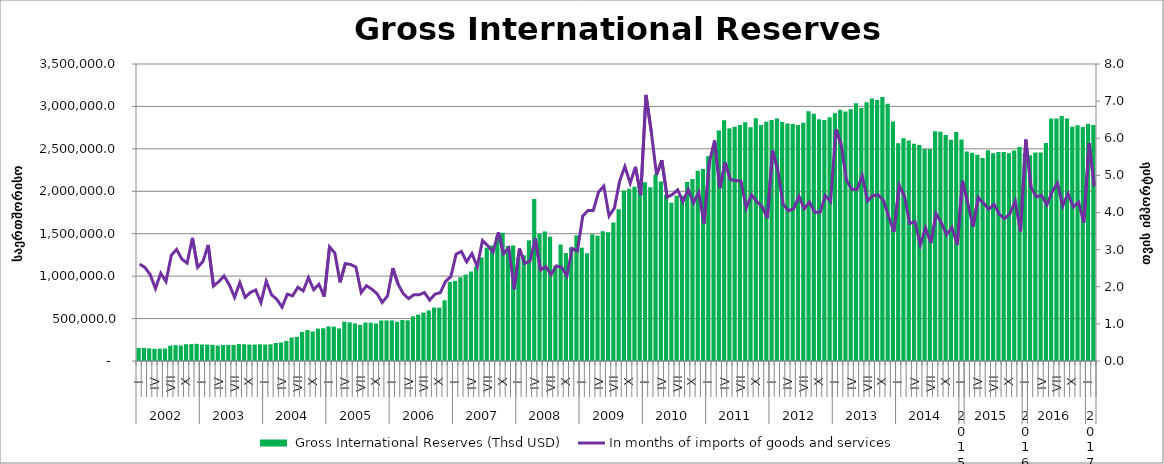
| Category |  Gross International Reserves (Thsd USD) |
|---|---|
| 0 | 154673.704 |
| 1 | 153155.96 |
| 2 | 148933.399 |
| 3 | 143590.72 |
| 4 | 145319.049 |
| 5 | 146717.063 |
| 6 | 180817.631 |
| 7 | 186466.393 |
| 8 | 182356.497 |
| 9 | 197532.435 |
| 10 | 198790.782 |
| 11 | 202167.392 |
| 12 | 194129.443 |
| 13 | 193695.576 |
| 14 | 190301.129 |
| 15 | 182095.356 |
| 16 | 188031.334 |
| 17 | 188868.329 |
| 18 | 189158.085 |
| 19 | 200204.792 |
| 20 | 197358.744 |
| 21 | 193613.624 |
| 22 | 194104.191 |
| 23 | 196187.768 |
| 24 | 193920.86 |
| 25 | 196811.48 |
| 26 | 212514.444 |
| 27 | 217948.403 |
| 28 | 236483.486 |
| 29 | 276240.683 |
| 30 | 284092.921 |
| 31 | 343688.446 |
| 32 | 365243.367 |
| 33 | 348545.007 |
| 34 | 381574.09 |
| 35 | 386639.086 |
| 36 | 408264.957 |
| 37 | 405450.857 |
| 38 | 384368.232 |
| 39 | 463997.258 |
| 40 | 455404.344 |
| 41 | 442635.363 |
| 42 | 426159.688 |
| 43 | 453374.04 |
| 44 | 450574.549 |
| 45 | 442442.215 |
| 46 | 477938.582 |
| 47 | 478645.824 |
| 48 | 477387.048 |
| 49 | 462352.78 |
| 50 | 483457.594 |
| 51 | 479645.109 |
| 52 | 525209.311 |
| 53 | 546894.155 |
| 54 | 569710.236 |
| 55 | 596495.846 |
| 56 | 630472.229 |
| 57 | 628326.311 |
| 58 | 715014.425 |
| 59 | 930833.393 |
| 60 | 944569.356 |
| 61 | 986716.087 |
| 62 | 1018970.638 |
| 63 | 1054278.365 |
| 64 | 1114160.468 |
| 65 | 1220729.487 |
| 66 | 1336062.499 |
| 67 | 1360970.198 |
| 68 | 1469799.647 |
| 69 | 1510431.083 |
| 70 | 1355160.588 |
| 71 | 1361139.94 |
| 72 | 1218380.992 |
| 73 | 1245880.818 |
| 74 | 1421919.99 |
| 75 | 1910253.845 |
| 76 | 1497582.718 |
| 77 | 1526134.644 |
| 78 | 1464749.428 |
| 79 | 1122855.834 |
| 80 | 1373330.153 |
| 81 | 1272102.001 |
| 82 | 1339757.483 |
| 83 | 1480157.563 |
| 84 | 1335830.434 |
| 85 | 1269325.862 |
| 86 | 1493108.058 |
| 87 | 1476027.716 |
| 88 | 1530375.506 |
| 89 | 1518203.703 |
| 90 | 1632579.525 |
| 91 | 1788341.435 |
| 92 | 2009955.589 |
| 93 | 2030508.619 |
| 94 | 2052635.598 |
| 95 | 2110413.479 |
| 96 | 2106203.981 |
| 97 | 2046269.085 |
| 98 | 2199234.144 |
| 99 | 2116174.036 |
| 100 | 1957092.26 |
| 101 | 1864408.87 |
| 102 | 1947257.286 |
| 103 | 1948646.735 |
| 104 | 2110240.516 |
| 105 | 2143452.411 |
| 106 | 2243098.08 |
| 107 | 2263931.003 |
| 108 | 2413276.234 |
| 109 | 2519379.834 |
| 110 | 2717701.26 |
| 111 | 2838315.136 |
| 112 | 2741576.745 |
| 113 | 2759253.793 |
| 114 | 2782237.942 |
| 115 | 2813452.719 |
| 116 | 2755211.768 |
| 117 | 2861887.778 |
| 118 | 2780195.98 |
| 119 | 2818259.268 |
| 120 | 2839594.988 |
| 121 | 2856750.893 |
| 122 | 2816704.829 |
| 123 | 2798459.455 |
| 124 | 2793387.554 |
| 125 | 2780985.069 |
| 126 | 2807413.792 |
| 127 | 2943749.499 |
| 128 | 2914658.817 |
| 129 | 2849332.726 |
| 130 | 2841471.603 |
| 131 | 2872974.007 |
| 132 | 2920913.483 |
| 133 | 2960164.648 |
| 134 | 2941281.374 |
| 135 | 2967640.231 |
| 136 | 3038439.423 |
| 137 | 2981696.572 |
| 138 | 3048940.273 |
| 139 | 3094880.401 |
| 140 | 3074514.403 |
| 141 | 3110052.596 |
| 142 | 3030762.59 |
| 143 | 2823422.31 |
| 144 | 2566485.807 |
| 145 | 2625815.897 |
| 146 | 2598611.489 |
| 147 | 2561530.614 |
| 148 | 2546888.469 |
| 149 | 2498141.455 |
| 150 | 2499536.21 |
| 151 | 2707900.374 |
| 152 | 2701161.577 |
| 153 | 2661929.063 |
| 154 | 2607504.967 |
| 155 | 2699187.561 |
| 156 | 2610108.469 |
| 157 | 2469434.991 |
| 158 | 2452879.825 |
| 159 | 2430898.174 |
| 160 | 2393461.564 |
| 161 | 2483749.819 |
| 162 | 2447135.694 |
| 163 | 2463246.038 |
| 164 | 2464305.635 |
| 165 | 2448949.349 |
| 166 | 2479433.026 |
| 167 | 2520576.458 |
| 168 | 2447473.906 |
| 169 | 2425874.122 |
| 170 | 2456678.704 |
| 171 | 2456757.547 |
| 172 | 2569385.763 |
| 173 | 2857243.993 |
| 174 | 2856372.165 |
| 175 | 2888476.122 |
| 176 | 2858235.696 |
| 177 | 2760196.146 |
| 178 | 2779157.145 |
| 179 | 2757417.107 |
| 180 | 2797144.593 |
| 181 | 2781130.045 |